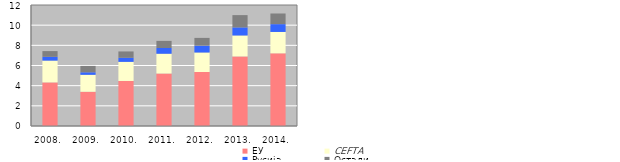
| Category | ЕУ | CEFTА | Русија | Остали |
|---|---|---|---|---|
| 2008. | 4322.989 | 2163.402 | 374.123 | 568.332 |
| 2009. | 3394.805 | 1682.188 | 249.277 | 635.023 |
| 2010. | 4466.809 | 1894.451 | 403.393 | 628.719 |
| 2011. | 5204.111 | 1962.798 | 567.724 | 706.789 |
| 2012. | 5357.218 | 1932.332 | 675.712 | 773.599 |
| 2013. | 6898.54 | 2079.347 | 799.883 | 1218.936 |
| 2014. | 7204.16 | 2123.441 | 774.464 | 1054.973 |